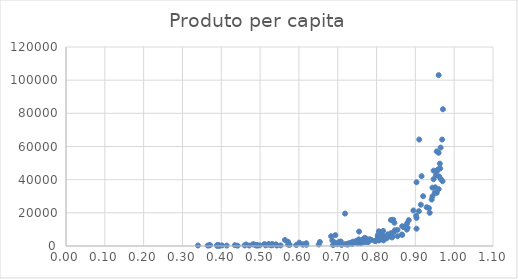
| Category | Produto per capita |
|---|---|
| 0.971 | 82480 |
| 0.97 | 39066 |
| 0.969 | 64190 |
| 0.966 | 40329 |
| 0.965 | 59324 |
| 0.964 | 46750 |
| 0.963 | 49662 |
| 0.961 | 41970 |
| 0.96 | 56207 |
| 0.96 | 34313 |
| 0.96 | 103042 |
| 0.959 | 46261 |
| 0.956 | 45592 |
| 0.955 | 44879 |
| 0.955 | 32017 |
| 0.955 | 57051 |
| 0.953 | 42609 |
| 0.951 | 35396 |
| 0.95 | 32086 |
| 0.947 | 45442 |
| 0.947 | 40324 |
| 0.944 | 35163 |
| 0.944 | 29912 |
| 0.942 | 27995 |
| 0.937 | 20014 |
| 0.935 | 22835 |
| 0.929 | 23379 |
| 0.92 | 30032 |
| 0.916 | 42102 |
| 0.914 | 24895 |
| 0.91 | 64193 |
| 0.909 | 20998 |
| 0.903 | 38436 |
| 0.903 | 16934 |
| 0.903 | 10427 |
| 0.902 | 18203 |
| 0.895 | 21421 |
| 0.883 | 15578 |
| 0.88 | 11072 |
| 0.879 | 13766 |
| 0.878 | 9878 |
| 0.871 | 11559 |
| 0.87 | 11356 |
| 0.866 | 11930 |
| 0.866 | 6644 |
| 0.865 | 6960 |
| 0.854 | 9715 |
| 0.854 | 5887 |
| 0.847 | 9475 |
| 0.846 | 14031 |
| 0.844 | 8299 |
| 0.843 | 15800 |
| 0.84 | 5833 |
| 0.84 | 5163 |
| 0.837 | 7703 |
| 0.837 | 15668 |
| 0.834 | 5804 |
| 0.829 | 7033 |
| 0.826 | 5435 |
| 0.826 | 4615 |
| 0.821 | 5834 |
| 0.818 | 3405 |
| 0.817 | 9079 |
| 0.817 | 3767 |
| 0.813 | 5724 |
| 0.813 | 6855 |
| 0.812 | 4014 |
| 0.807 | 4724 |
| 0.806 | 3846 |
| 0.806 | 8877 |
| 0.806 | 3335 |
| 0.804 | 5383 |
| 0.804 | 6772 |
| 0.803 | 5944 |
| 0.798 | 3059 |
| 0.796 | 3035 |
| 0.787 | 3652 |
| 0.783 | 3844 |
| 0.782 | 4028 |
| 0.778 | 2313 |
| 0.777 | 3772 |
| 0.772 | 4596 |
| 0.772 | 2432 |
| 0.772 | 4200 |
| 0.771 | 2894 |
| 0.771 | 3456 |
| 0.77 | 2769 |
| 0.769 | 4896 |
| 0.769 | 3425 |
| 0.768 | 2474 |
| 0.766 | 4272 |
| 0.761 | 1997 |
| 0.759 | 1616 |
| 0.755 | 8696 |
| 0.754 | 3996 |
| 0.751 | 1639 |
| 0.747 | 2973 |
| 0.742 | 1898 |
| 0.739 | 2606 |
| 0.737 | 1160 |
| 0.734 | 1918 |
| 0.732 | 1722 |
| 0.729 | 1379 |
| 0.727 | 1507 |
| 0.725 | 806 |
| 0.72 | 1156 |
| 0.719 | 19552 |
| 0.71 | 830 |
| 0.71 | 715 |
| 0.708 | 2705 |
| 0.704 | 2536 |
| 0.703 | 1729 |
| 0.699 | 1022 |
| 0.694 | 6544 |
| 0.693 | 2001 |
| 0.688 | 551 |
| 0.686 | 3372 |
| 0.683 | 5914 |
| 0.654 | 2434 |
| 0.651 | 916 |
| 0.619 | 1668 |
| 0.619 | 701 |
| 0.612 | 1046 |
| 0.61 | 784 |
| 0.601 | 2030 |
| 0.593 | 578 |
| 0.576 | 714 |
| 0.575 | 1006 |
| 0.572 | 879 |
| 0.572 | 2521 |
| 0.564 | 3623 |
| 0.553 | 367 |
| 0.543 | 375 |
| 0.543 | 431 |
| 0.541 | 645 |
| 0.541 | 990 |
| 0.532 | 699 |
| 0.531 | 1199 |
| 0.53 | 400 |
| 0.526 | 646 |
| 0.523 | 1116 |
| 0.52 | 847 |
| 0.514 | 798 |
| 0.514 | 381 |
| 0.511 | 1118 |
| 0.499 | 380 |
| 0.493 | 256 |
| 0.492 | 601 |
| 0.489 | 373 |
| 0.484 | 1027 |
| 0.481 | 953 |
| 0.472 | 284 |
| 0.464 | 900 |
| 0.46 | 343 |
| 0.442 | 198 |
| 0.435 | 487 |
| 0.414 | 245 |
| 0.402 | 364 |
| 0.396 | 211 |
| 0.394 | 115 |
| 0.392 | 658 |
| 0.389 | 143 |
| 0.389 | 458 |
| 0.371 | 556 |
| 0.369 | 394 |
| 0.365 | 284 |
| 0.34 | 294 |